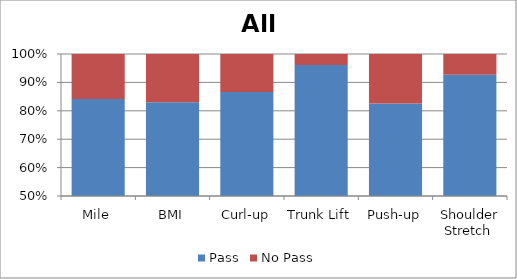
| Category | Pass | No Pass |
|---|---|---|
| Mile | 602 | 113 |
| BMI | 551 | 113 |
| Curl-up | 701 | 108 |
| Trunk Lift | 794 | 32 |
| Push-up | 633 | 134 |
| Shoulder Stretch  | 775 | 61 |